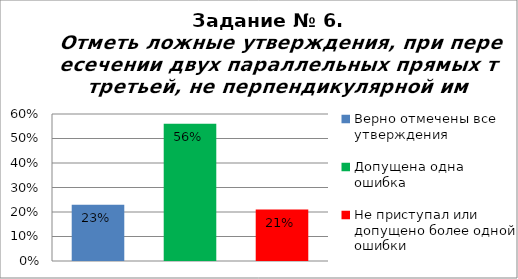
| Category | Отметь ложные утверждения, при пересечении двух параллельных прямых третьей, не перпендикулярной им. |
|---|---|
| Верно отмечены все утверждения | 0.23 |
| Допущена одна ошибка | 0.56 |
| Не приступал или допущено более одной ошибки | 0.21 |